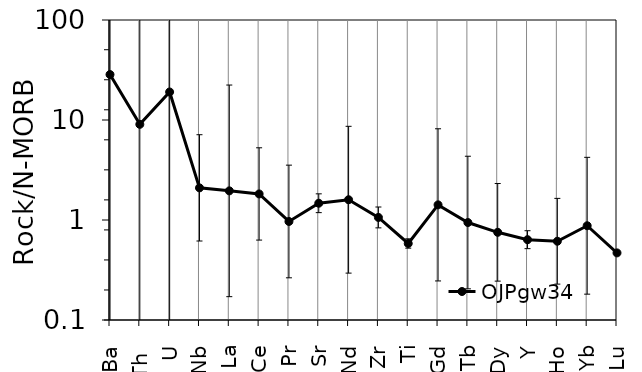
| Category | OJPgw34 |
|---|---|
| Ba | 28.49 |
| Th  | 9.051 |
| U | 19.063 |
| Nb | 2.096 |
| La | 1.956 |
| Ce | 1.822 |
| Pr | 0.967 |
| Sr | 1.471 |
| Nd | 1.595 |
| Zr | 1.061 |
| Ti | 0.582 |
| Gd | 1.417 |
| Tb | 0.943 |
| Dy | 0.753 |
| Y | 0.636 |
| Ho | 0.613 |
| Yb | 0.876 |
| Lu | 0.469 |